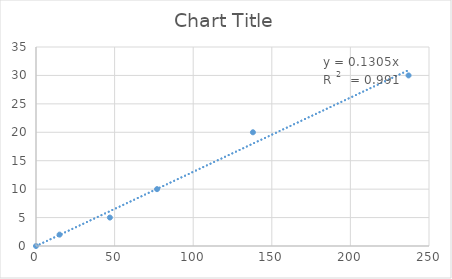
| Category | Series 0 |
|---|---|
| 0.0 | 0 |
| 15.0 | 2 |
| 47.0 | 5 |
| 77.0 | 10 |
| 138.0 | 20 |
| 237.0 | 30 |